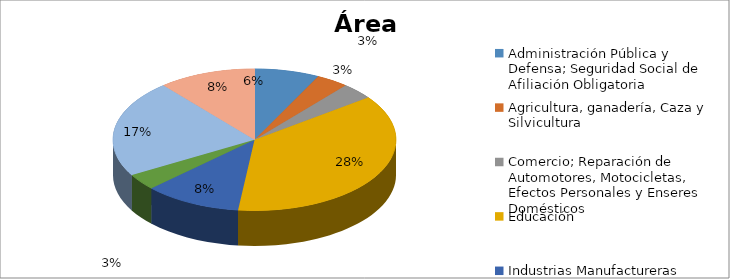
| Category | Series 0 |
|---|---|
| Administración Pública y Defensa; Seguridad Social de Afiliación Obligatoria | 0.056 |
| Agricultura, ganadería, Caza y Silvicultura | 0.028 |
| Comercio; Reparación de Automotores, Motocicletas, Efectos Personales y Enseres Domésticos | 0.028 |
| Educación | 0.278 |
| Industrias Manufactureras | 0.083 |
| Otras Actividades de Servicios Comunitarios, Sociales y Personales | 0.028 |
| Servicios Sociales y de Salud | 0.167 |
| Suministros de Electricidad, Gas y Agua | 0.083 |